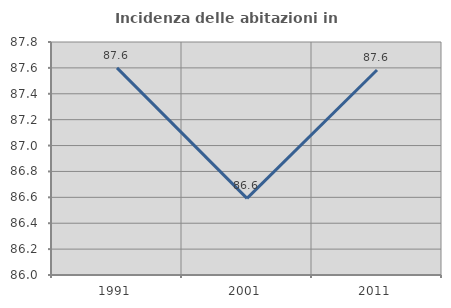
| Category | Incidenza delle abitazioni in proprietà  |
|---|---|
| 1991.0 | 87.6 |
| 2001.0 | 86.592 |
| 2011.0 | 87.584 |